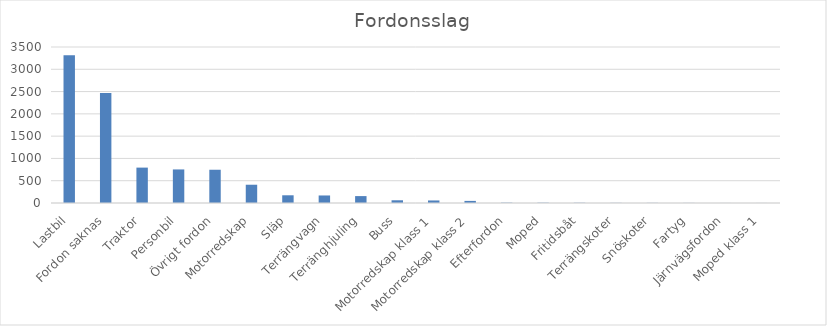
| Category | Summa |
|---|---|
| Lastbil | 3316 |
| Fordon saknas | 2468 |
| Traktor | 794 |
| Personbil | 753 |
| Övrigt fordon | 746 |
| Motorredskap | 410 |
| Släp | 173 |
| Terrängvagn | 169 |
| Terränghjuling | 155 |
| Buss | 61 |
| Motorredskap klass 1 | 57 |
| Motorredskap klass 2 | 47 |
| Efterfordon | 7 |
| Moped | 6 |
| Fritidsbåt | 5 |
| Terrängskoter | 3 |
| Snöskoter | 3 |
| Fartyg | 2 |
| Järnvägsfordon | 1 |
| Moped klass 1 | 1 |